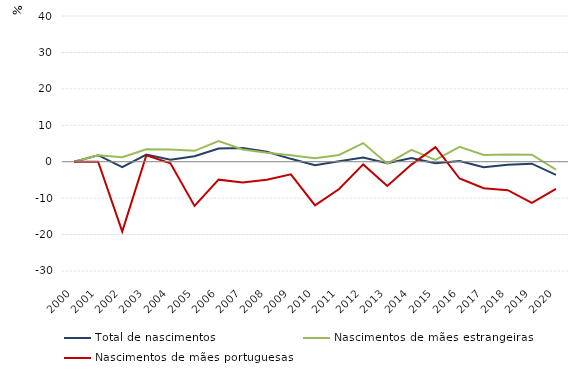
| Category | Total de nascimentos | Nascimentos de mães estrangeiras | Nascimentos de mães portuguesas |
|---|---|---|---|
| 2000.0 | 0 | 0 | 0 |
| 2001.0 | 1.786 | 1.776 | 0 |
| 2002.0 | -1.479 | 1.208 | -19.149 |
| 2003.0 | 1.945 | 3.418 | 1.754 |
| 2004.0 | 0.559 | 3.34 | -0.431 |
| 2005.0 | 1.513 | 2.99 | -12.121 |
| 2006.0 | 3.636 | 5.669 | -4.926 |
| 2007.0 | 3.736 | 3.359 | -5.699 |
| 2008.0 | 2.724 | 2.472 | -4.945 |
| 2009.0 | 0.789 | 1.796 | -3.468 |
| 2010.0 | -0.958 | 0.986 | -11.976 |
| 2011.0 | 0.111 | 1.861 | -7.483 |
| 2012.0 | 1.121 | 5.113 | -0.735 |
| 2013.0 | -0.406 | -0.534 | -6.667 |
| 2014.0 | 0.994 | 3.259 | -0.794 |
| 2015.0 | -0.444 | 0.485 | 4 |
| 2016.0 | 0.184 | 4.071 | -4.615 |
| 2017.0 | -1.513 | 1.838 | -7.258 |
| 2018.0 | -0.863 | 2.008 | -7.826 |
| 2019.0 | -0.537 | 1.917 | -11.321 |
| 2020.0 | -3.613 | -2.162 | -7.447 |